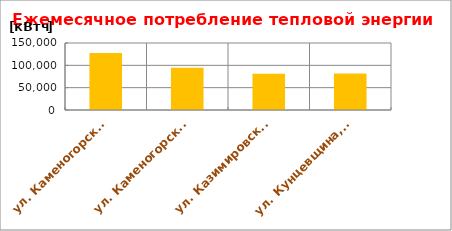
| Category | Series 0 |
|---|---|
| ул. Каменогорская, 30 | 127576.8 |
| ул. Каменогорская, 86 | 94526.467 |
| ул. Казимировская, 9 | 81103.333 |
| ул. Кунцевщина, 35 | 81785.8 |